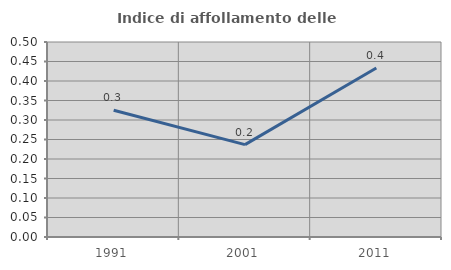
| Category | Indice di affollamento delle abitazioni  |
|---|---|
| 1991.0 | 0.325 |
| 2001.0 | 0.237 |
| 2011.0 | 0.433 |